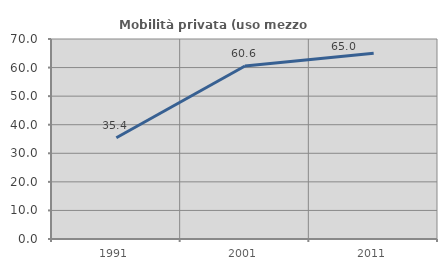
| Category | Mobilità privata (uso mezzo privato) |
|---|---|
| 1991.0 | 35.426 |
| 2001.0 | 60.563 |
| 2011.0 | 65.03 |